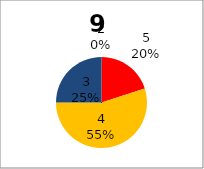
| Category | Series 0 |
|---|---|
| 5.0 | 4 |
| 4.0 | 11 |
| 3.0 | 5 |
| 2.0 | 0 |